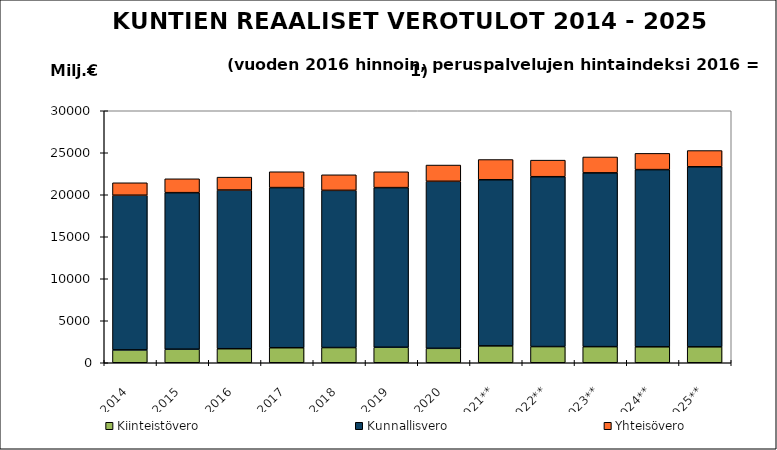
| Category | Kiinteistövero | Kunnallisvero | Yhteisövero |
|---|---|---|---|
| 2014 | 1530.151 | 18415.782 | 1479.005 |
| 2015 | 1613.607 | 18634.72 | 1651.359 |
| 2016 | 1669.703 | 18890.563 | 1537.872 |
| 2017 | 1789.239 | 19064.268 | 1884.667 |
| 2018 | 1809.209 | 18714.38 | 1852.755 |
| 2019 | 1847.54 | 19002.13 | 1885.594 |
| 2020 | 1718.131 | 19884.816 | 1934.106 |
| 2021** | 2010.447 | 19775.838 | 2406.737 |
| 2022** | 1926.683 | 20220.63 | 1974.373 |
| 2023** | 1917.635 | 20689.782 | 1889.435 |
| 2024** | 1898.227 | 21093.474 | 1935.266 |
| 2025** | 1896.308 | 21433.747 | 1932.775 |